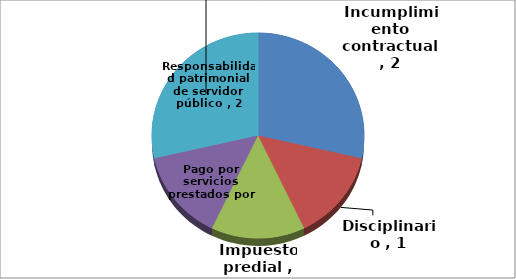
| Category | Series 0 |
|---|---|
| Incumplimiento contractual  | 2 |
| Disciplinario  | 1 |
| Impuesto predial  | 1 |
| Pago por servicios prestados por IDEAM | 1 |
| Responsabilidad patrimonial de servidor público  | 2 |